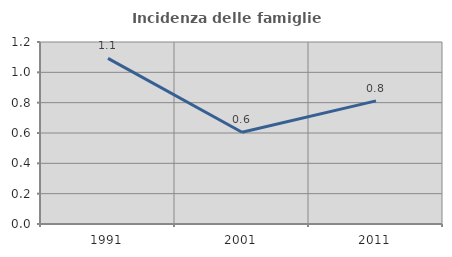
| Category | Incidenza delle famiglie numerose |
|---|---|
| 1991.0 | 1.092 |
| 2001.0 | 0.605 |
| 2011.0 | 0.812 |